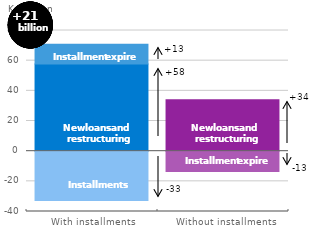
| Category | New loans and restructuring | Expiration of the installment-free period | Installments |
|---|---|---|---|
| With installments | 57.84 | 13.073 | -32.633 |
| Without installments | 34.111 | -13.414 | 0 |